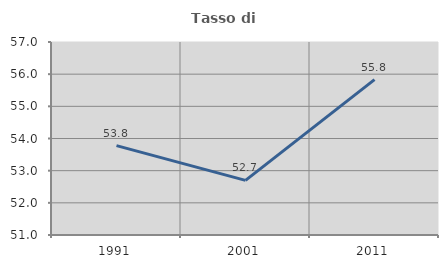
| Category | Tasso di occupazione   |
|---|---|
| 1991.0 | 53.778 |
| 2001.0 | 52.697 |
| 2011.0 | 55.832 |